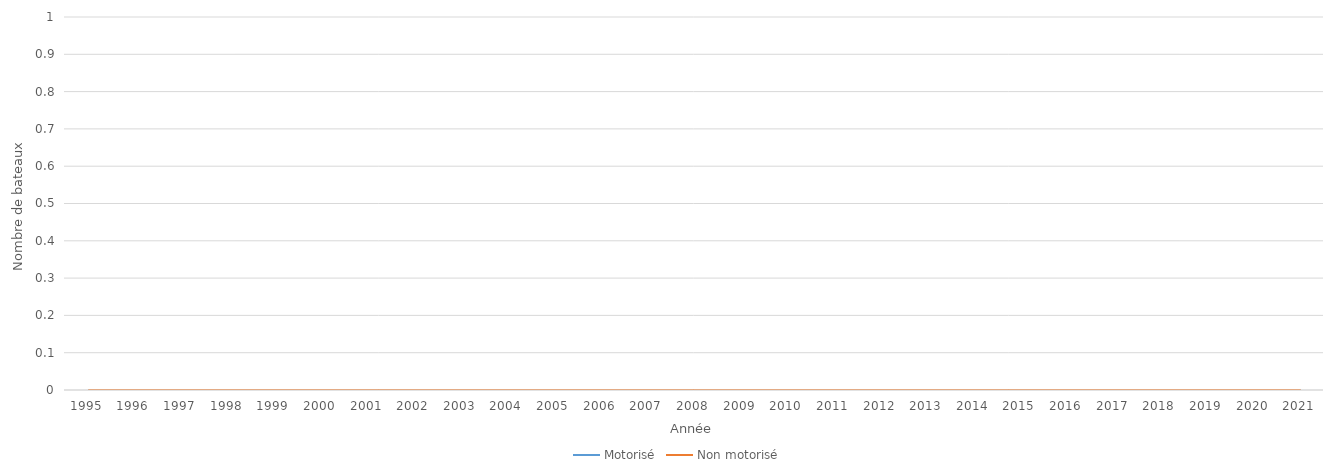
| Category | Motorisé | Non motorisé |
|---|---|---|
| 1995.0 | 0 | 0 |
| 1996.0 | 0 | 0 |
| 1997.0 | 0 | 0 |
| 1998.0 | 0 | 0 |
| 1999.0 | 0 | 0 |
| 2000.0 | 0 | 0 |
| 2001.0 | 0 | 0 |
| 2002.0 | 0 | 0 |
| 2003.0 | 0 | 0 |
| 2004.0 | 0 | 0 |
| 2005.0 | 0 | 0 |
| 2006.0 | 0 | 0 |
| 2007.0 | 0 | 0 |
| 2008.0 | 0 | 0 |
| 2009.0 | 0 | 0 |
| 2010.0 | 0 | 0 |
| 2011.0 | 0 | 0 |
| 2012.0 | 0 | 0 |
| 2013.0 | 0 | 0 |
| 2014.0 | 0 | 0 |
| 2015.0 | 0 | 0 |
| 2016.0 | 0 | 0 |
| 2017.0 | 0 | 0 |
| 2018.0 | 0 | 0 |
| 2019.0 | 0 | 0 |
| 2020.0 | 0 | 0 |
| 2021.0 | 0 | 0 |